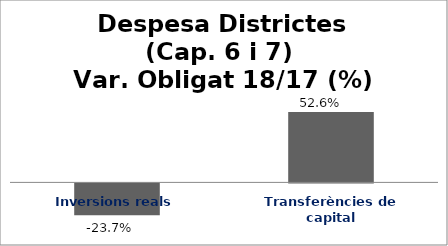
| Category | Series 0 |
|---|---|
| Inversions reals | -0.237 |
| Transferències de capital | 0.526 |